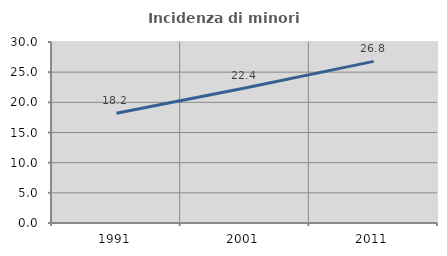
| Category | Incidenza di minori stranieri |
|---|---|
| 1991.0 | 18.182 |
| 2001.0 | 22.388 |
| 2011.0 | 26.792 |